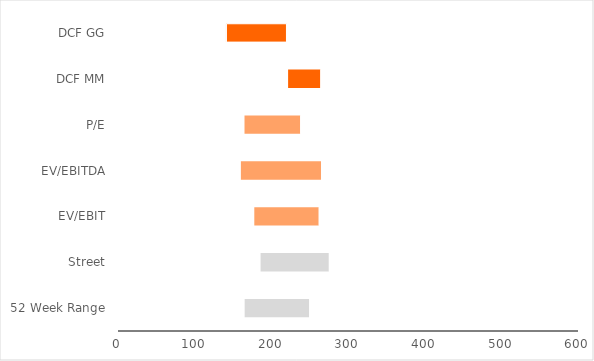
| Category | Series 0 | Series 1 | Series 2 |
|---|---|---|---|
| 52 Week Range | 165.22 | 84.05 | 249.27 |
| Street | 186 | 89 | 275 |
| EV/EBIT | 177.775 | 84.037 | 261.812 |
| EV/EBITDA | 160.297 | 104.538 | 264.835 |
| P/E | 165.01 | 72.63 | 237.64 |
| DCF MM | 221.875 | 42.02 | 263.895 |
| DCF GG | 140.826 | 78.913 | 219.74 |